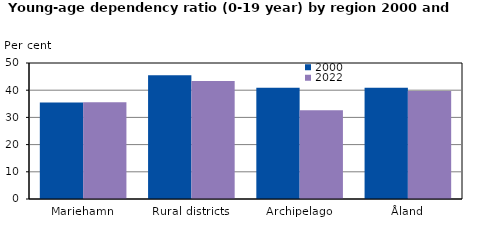
| Category | 2000 | 2022 |
|---|---|---|
| Mariehamn | 35.463 | 35.566 |
| Rural districts | 45.524 | 43.422 |
| Archipelago | 40.92 | 32.649 |
| Åland | 40.872 | 39.709 |